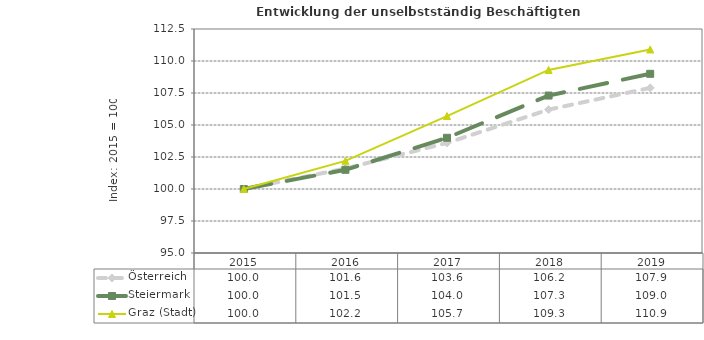
| Category | Österreich | Steiermark | Graz (Stadt) |
|---|---|---|---|
| 2019.0 | 107.9 | 109 | 110.9 |
| 2018.0 | 106.2 | 107.3 | 109.3 |
| 2017.0 | 103.6 | 104 | 105.7 |
| 2016.0 | 101.6 | 101.5 | 102.2 |
| 2015.0 | 100 | 100 | 100 |